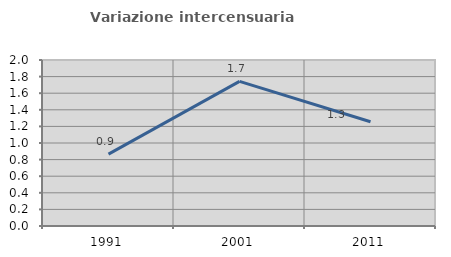
| Category | Variazione intercensuaria annua |
|---|---|
| 1991.0 | 0.866 |
| 2001.0 | 1.743 |
| 2011.0 | 1.256 |